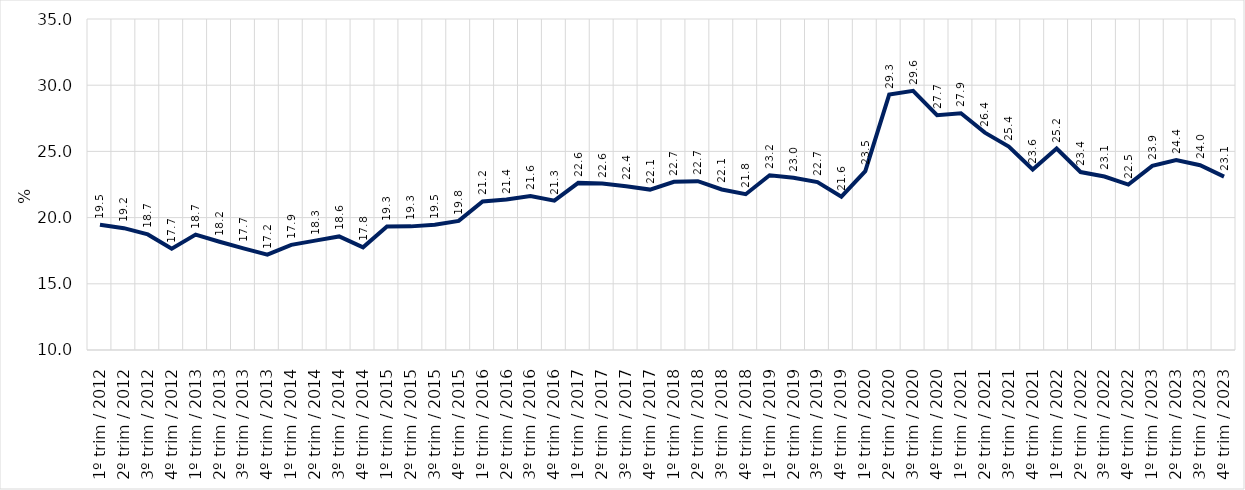
| Category | Series 0 |
|---|---|
| 1º trim / 2012 | 19.467 |
| 2º trim / 2012 | 19.201 |
| 3º trim / 2012 | 18.73 |
| 4º trim / 2012 | 17.658 |
| 1º trim / 2013 | 18.72 |
| 2º trim / 2013 | 18.177 |
| 3º trim / 2013 | 17.67 |
| 4º trim / 2013 | 17.198 |
| 1º trim / 2014 | 17.938 |
| 2º trim / 2014 | 18.26 |
| 3º trim / 2014 | 18.579 |
| 4º trim / 2014 | 17.755 |
| 1º trim / 2015 | 19.326 |
| 2º trim / 2015 | 19.338 |
| 3º trim / 2015 | 19.458 |
| 4º trim / 2015 | 19.751 |
| 1º trim / 2016 | 21.224 |
| 2º trim / 2016 | 21.367 |
| 3º trim / 2016 | 21.635 |
| 4º trim / 2016 | 21.277 |
| 1º trim / 2017 | 22.622 |
| 2º trim / 2017 | 22.569 |
| 3º trim / 2017 | 22.36 |
| 4º trim / 2017 | 22.116 |
| 1º trim / 2018 | 22.701 |
| 2º trim / 2018 | 22.747 |
| 3º trim / 2018 | 22.123 |
| 4º trim / 2018 | 21.765 |
| 1º trim / 2019 | 23.201 |
| 2º trim / 2019 | 23.016 |
| 3º trim / 2019 | 22.685 |
| 4º trim / 2019 | 21.579 |
| 1º trim / 2020 | 23.505 |
| 2º trim / 2020 | 29.29 |
| 3º trim / 2020 | 29.57 |
| 4º trim / 2020 | 27.736 |
| 1º trim / 2021 | 27.883 |
| 2º trim / 2021 | 26.417 |
| 3º trim / 2021 | 25.368 |
| 4º trim / 2021 | 23.631 |
| 1º trim / 2022 | 25.217 |
| 2º trim / 2022 | 23.442 |
| 3º trim / 2022 | 23.105 |
| 4º trim / 2022 | 22.493 |
| 1º trim / 2023 | 23.907 |
| 2º trim / 2023 | 24.35 |
| 3º trim / 2023 | 23.953 |
| 4º trim / 2023 | 23.099 |